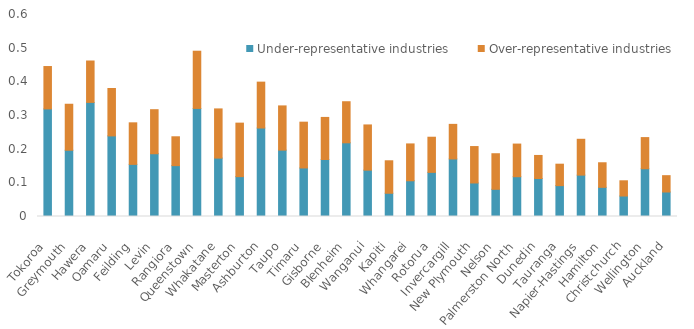
| Category | Under-representative industries | Over-representative industries |
|---|---|---|
| Tokoroa | 0.32 | 0.126 |
| Greymouth | 0.197 | 0.137 |
| Hawera | 0.339 | 0.123 |
| Oamaru | 0.239 | 0.141 |
| Feilding | 0.155 | 0.123 |
| Levin | 0.186 | 0.131 |
| Rangiora | 0.151 | 0.086 |
| Queenstown | 0.321 | 0.17 |
| Whakatane | 0.173 | 0.146 |
| Masterton | 0.118 | 0.159 |
| Ashburton | 0.263 | 0.136 |
| Taupo | 0.197 | 0.131 |
| Timaru | 0.144 | 0.136 |
| Gisborne | 0.169 | 0.125 |
| Blenheim | 0.219 | 0.122 |
| Wanganui | 0.138 | 0.134 |
| Kapiti | 0.069 | 0.096 |
| Whangarei | 0.106 | 0.109 |
| Rotorua | 0.131 | 0.104 |
| Invercargill | 0.171 | 0.103 |
| New Plymouth | 0.1 | 0.108 |
| Nelson | 0.081 | 0.106 |
| Palmerston North | 0.118 | 0.097 |
| Dunedin | 0.113 | 0.069 |
| Tauranga | 0.092 | 0.064 |
| Napier-Hastings | 0.123 | 0.106 |
| Hamilton | 0.087 | 0.073 |
| Christchurch | 0.061 | 0.045 |
| Wellington | 0.142 | 0.093 |
| Auckland | 0.073 | 0.049 |